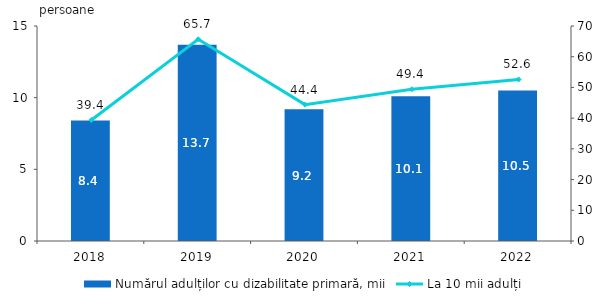
| Category | Numărul adulților cu dizabilitate primară, mii |
|---|---|
| 2018.0 | 8.4 |
| 2019.0 | 13.7 |
| 2020.0 | 9.2 |
| 2021.0 | 10.1 |
| 2022.0 | 10.5 |